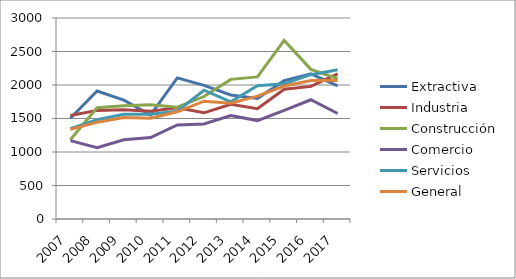
| Category | Extractiva  | Industria | Construcción | Comercio | Servicios | General |
|---|---|---|---|---|---|---|
| 2007.0 | 1503 | 1546 | 1182 | 1170 | 1348 | 1338 |
| 2008.0 | 1911 | 1621 | 1660 | 1065 | 1481 | 1444 |
| 2009.0 | 1774 | 1629 | 1690 | 1182 | 1563 | 1514 |
| 2010.0 | 1552 | 1610 | 1704 | 1215 | 1563 | 1505 |
| 2011.0 | 2106 | 1659 | 1668 | 1404 | 1610 | 1600 |
| 2012.0 | 1994 | 1585 | 1828 | 1419 | 1922 | 1758 |
| 2013.0 | 1852 | 1713 | 2084 | 1544 | 1748 | 1727 |
| 2014.0 | 1798 | 1646 | 2121 | 1469 | 1989 | 1833 |
| 2015.0 | 2065 | 1937 | 2666 | 1620 | 2017 | 1985 |
| 2016.0 | 2167 | 1979 | 2233 | 1780 | 2154 | 2066 |
| 2017.0 | 1988 | 2167 | 2097 | 1574 | 2229 | 2068 |